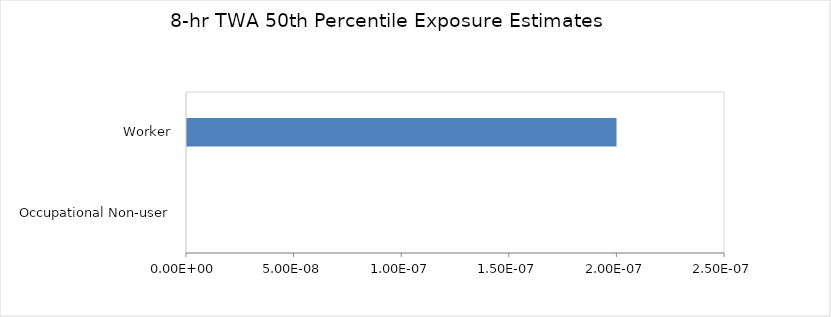
| Category | Series 0 |
|---|---|
| Occupational Non-user | 0 |
| Worker | 0 |